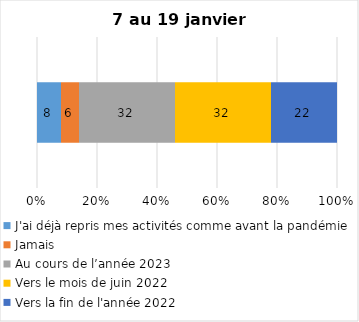
| Category | J'ai déjà repris mes activités comme avant la pandémie | Jamais | Au cours de l’année 2023 | Vers le mois de juin 2022 | Vers la fin de l'année 2022 |
|---|---|---|---|---|---|
| 0 | 8 | 6 | 32 | 32 | 22 |